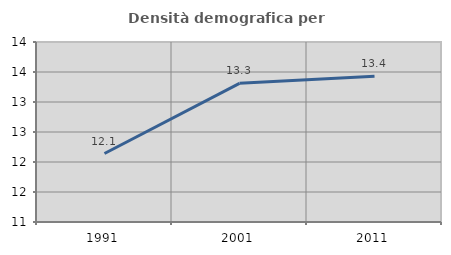
| Category | Densità demografica |
|---|---|
| 1991.0 | 12.142 |
| 2001.0 | 13.311 |
| 2011.0 | 13.43 |